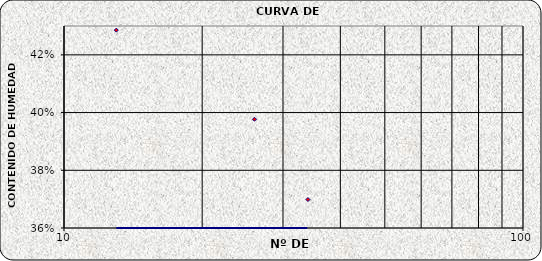
| Category | Series 0 |
|---|---|
| 34.0 | 0.37 |
| 26.0 | 0.398 |
| 13.0 | 0.429 |